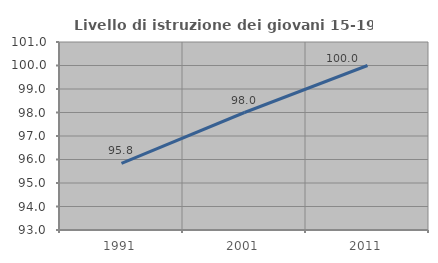
| Category | Livello di istruzione dei giovani 15-19 anni |
|---|---|
| 1991.0 | 95.833 |
| 2001.0 | 98 |
| 2011.0 | 100 |